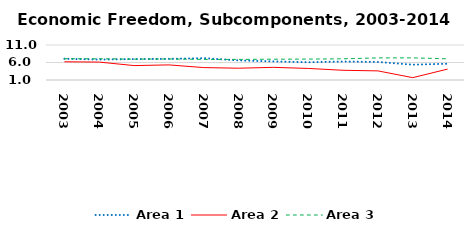
| Category | Area 1 | Area 2 | Area 3 |
|---|---|---|---|
| 2003.0 | 7.068 | 6.204 | 7.074 |
| 2004.0 | 6.843 | 6.118 | 7.074 |
| 2005.0 | 6.978 | 5.119 | 6.959 |
| 2006.0 | 7.043 | 5.314 | 7 |
| 2007.0 | 7.235 | 4.549 | 6.889 |
| 2008.0 | 6.6 | 4.367 | 6.883 |
| 2009.0 | 6.311 | 4.615 | 6.943 |
| 2010.0 | 6.072 | 4.3 | 6.975 |
| 2011.0 | 6.282 | 3.773 | 7.054 |
| 2012.0 | 6.15 | 3.605 | 7.311 |
| 2013.0 | 5.384 | 1.67 | 7.322 |
| 2014.0 | 5.642 | 4.115 | 7.054 |